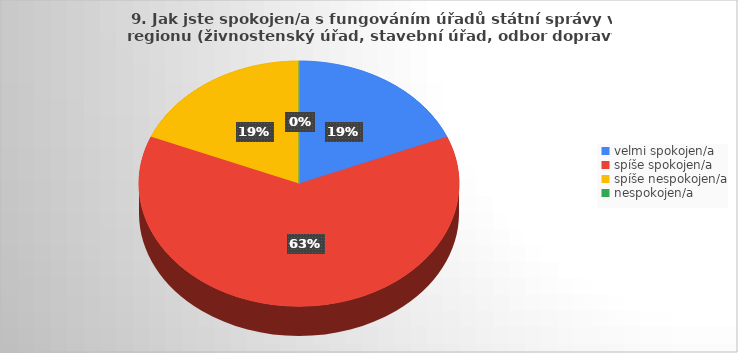
| Category | Series 0 |
|---|---|
| velmi spokojen/a | 3 |
| spíše spokojen/a | 10 |
| spíše nespokojen/a | 3 |
| nespokojen/a | 0 |